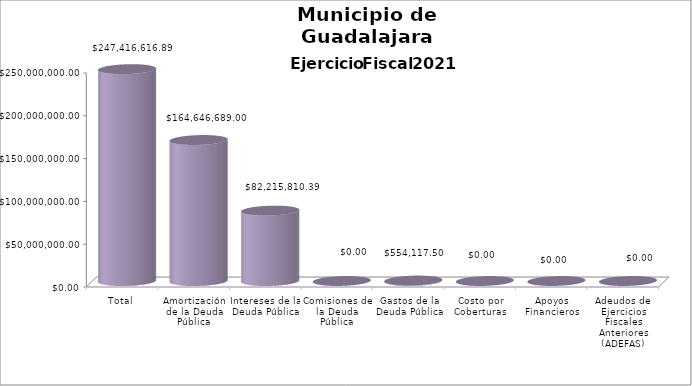
| Category | Municipio de Guadalajara
Deuda Pública 2021 |
|---|---|
| Total | 247416616.89 |
| Amortización de la Deuda Pública | 164646689 |
| Intereses de la Deuda Pública | 82215810.39 |
| Comisiones de la Deuda Pública | 0 |
| Gastos de la Deuda Pública | 554117.5 |
| Costo por Coberturas | 0 |
| Apoyos Financieros | 0 |
| Adeudos de Ejercicios Fiscales Anteriores (ADEFAS) | 0 |